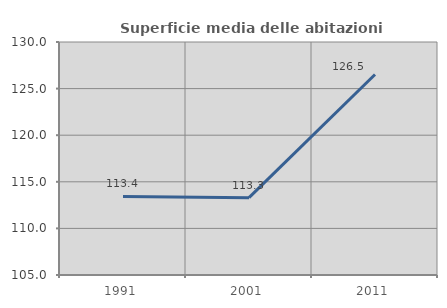
| Category | Superficie media delle abitazioni occupate |
|---|---|
| 1991.0 | 113.43 |
| 2001.0 | 113.295 |
| 2011.0 | 126.516 |